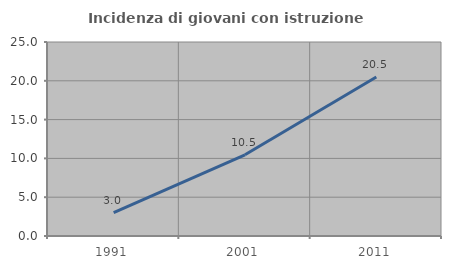
| Category | Incidenza di giovani con istruzione universitaria |
|---|---|
| 1991.0 | 3.019 |
| 2001.0 | 10.462 |
| 2011.0 | 20.497 |